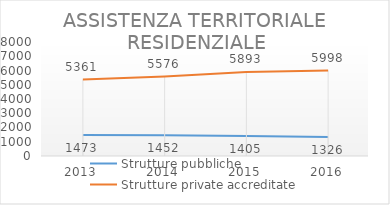
| Category | Strutture pubbliche | Strutture private accreditate |
|---|---|---|
| 2013.0 | 1473 | 5361 |
| 2014.0 | 1452 | 5576 |
| 2015.0 | 1405 | 5893 |
| 2016.0 | 1326 | 5998 |